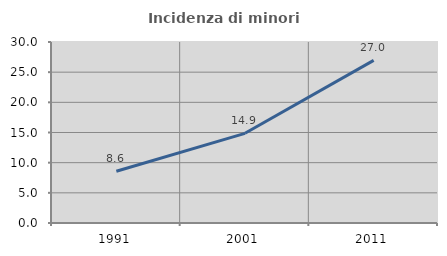
| Category | Incidenza di minori stranieri |
|---|---|
| 1991.0 | 8.571 |
| 2001.0 | 14.865 |
| 2011.0 | 26.957 |